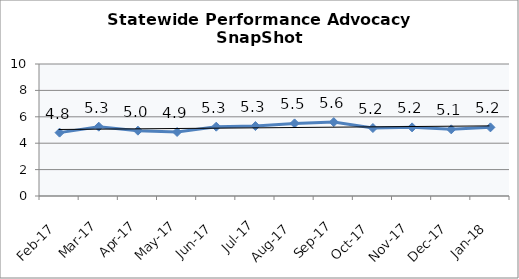
| Category | Statewide |
|---|---|
| Feb-17 | 4.8 |
| Mar-17 | 5.25 |
| Apr-17 | 4.95 |
| May-17 | 4.85 |
| Jun-17 | 5.25 |
| Jul-17 | 5.3 |
| Aug-17 | 5.5 |
| Sep-17 | 5.6 |
| Oct-17 | 5.15 |
| Nov-17 | 5.2 |
| Dec-17 | 5.05 |
| Jan-18 | 5.2 |